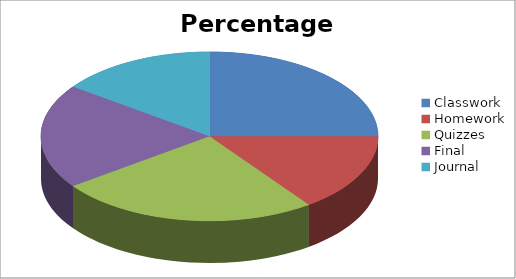
| Category | Percentages |
|---|---|
| Classwork | 25 |
| Homework | 15 |
| Quizzes | 25 |
| Final | 20 |
| Journal | 15 |